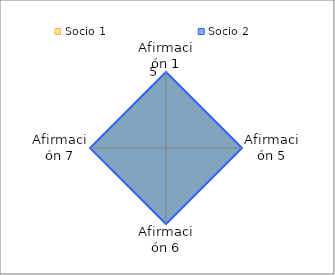
| Category | Socio 1 | Socio 2 |
|---|---|---|
| Afirmación 1 | 5 | 5 |
| Afirmación 5 | 5 | 5 |
| Afirmación 6 | 5 | 5 |
| Afirmación 7 | 5 | 5 |